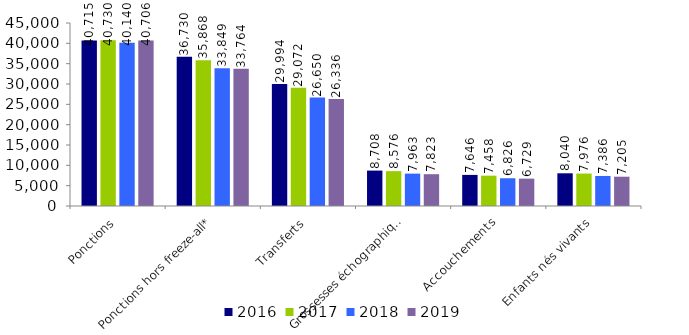
| Category | 2016 | 2017 | 2018 | 2019 |
|---|---|---|---|---|
| Ponctions | 40715 | 40730 | 40140 | 40706 |
| Ponctions hors freeze-all* | 36730 | 35868 | 33849 | 33764 |
| Transferts | 29994 | 29072 | 26650 | 26336 |
| Grossesses échographiques | 8708 | 8576 | 7963 | 7823 |
| Accouchements | 7646 | 7458 | 6826 | 6729 |
| Enfants nés vivants | 8040 | 7976 | 7386 | 7205 |